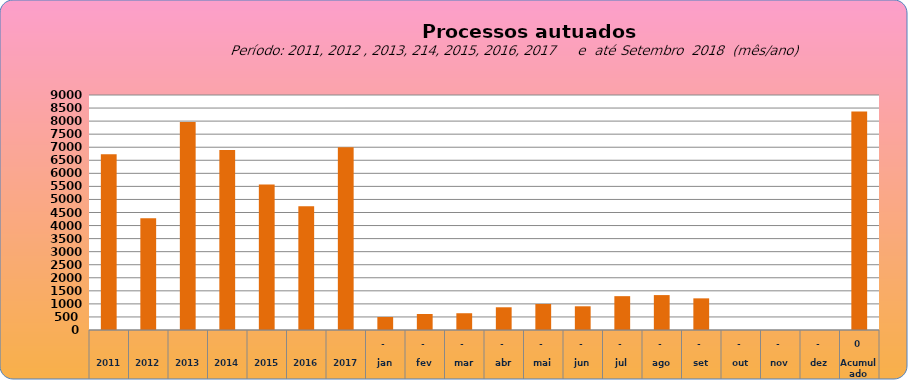
| Category | 6735 |
|---|---|
| 2011 | 6735 |
| 2012 | 4276 |
| 2013 | 7967 |
| 2014 | 6893 |
| 2015 | 5569 |
| 2016 | 4737 |
| 2017 | 6997 |
| jan | 498 |
| fev | 612 |
| mar | 642 |
| abr | 870 |
| mai | 995 |
| jun | 908 |
| jul | 1296 |
| ago | 1337 |
| set | 1212 |
| out | 0 |
| nov | 0 |
| dez | 0 |
| Acumulado
 | 8370 |